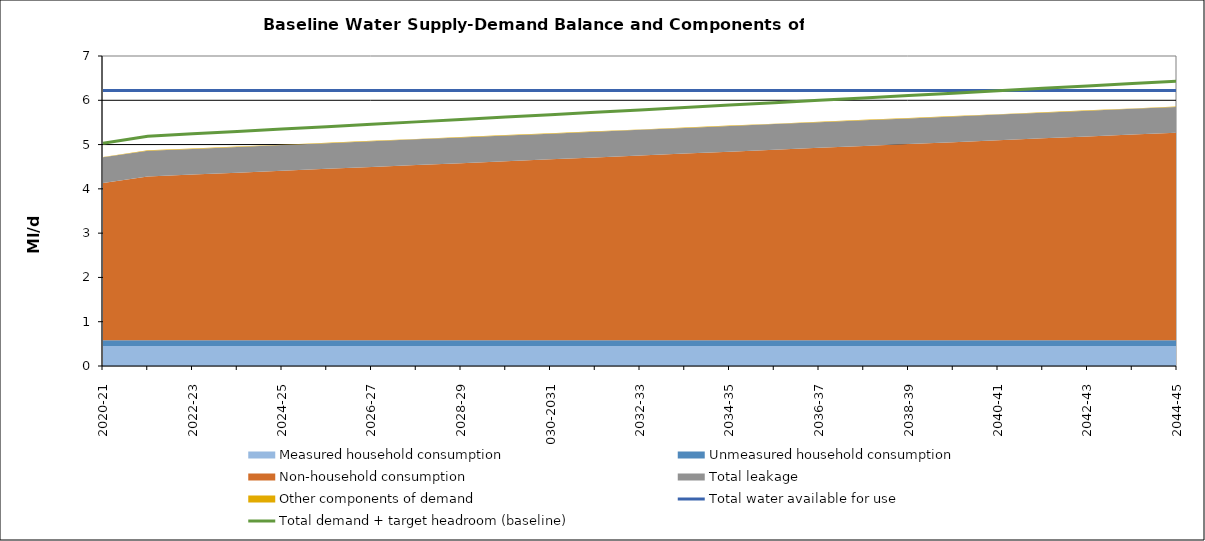
| Category | Total water available for use | Total demand + target headroom (baseline) |
|---|---|---|
| 0 | 6.22 | 5.03 |
| 1 | 6.22 | 5.188 |
| 2 | 6.22 | 5.242 |
| 3 | 6.22 | 5.296 |
| 4 | 6.22 | 5.35 |
| 5 | 6.22 | 5.404 |
| 6 | 6.22 | 5.458 |
| 7 | 6.22 | 5.512 |
| 8 | 6.22 | 5.567 |
| 9 | 6.22 | 5.621 |
| 10 | 6.22 | 5.675 |
| 11 | 6.22 | 5.729 |
| 12 | 6.22 | 5.783 |
| 13 | 6.22 | 5.837 |
| 14 | 6.22 | 5.891 |
| 15 | 6.22 | 5.945 |
| 16 | 6.22 | 5.999 |
| 17 | 6.22 | 6.053 |
| 18 | 6.22 | 6.107 |
| 19 | 6.22 | 6.161 |
| 20 | 6.22 | 6.215 |
| 21 | 6.22 | 6.27 |
| 22 | 6.22 | 6.324 |
| 23 | 6.22 | 6.378 |
| 24 | 6.22 | 6.432 |